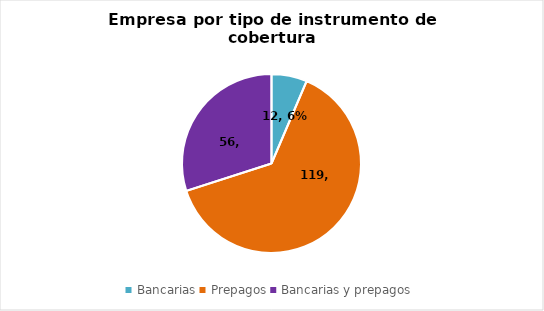
| Category | Series 0 |
|---|---|
| Bancarias | 12 |
| Prepagos | 119 |
| Bancarias y prepagos | 56 |